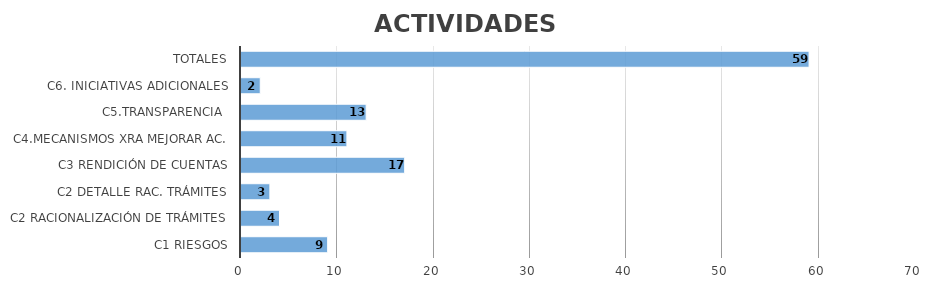
| Category | FORMULADAS |
|---|---|
| C1 RIESGOS | 9 |
| C2 RACIONALIZACIÓN DE TRÁMITES | 4 |
| C2 DETALLE RAC. TRÁMITES | 3 |
| C3 RENDICIÓN DE CUENTAS | 17 |
| C4.MECANISMOS XRA MEJORAR AC. | 11 |
| C5.TRANSPARENCIA  | 13 |
| C6. INICIATIVAS ADICIONALES | 2 |
| TOTALES | 59 |